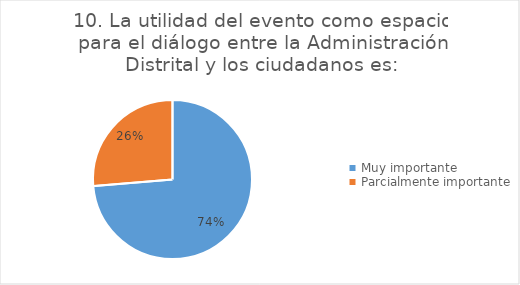
| Category | Series 0 |
|---|---|
| Muy importante | 14 |
| Parcialmente importante | 5 |